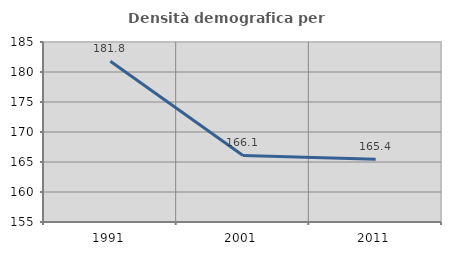
| Category | Densità demografica |
|---|---|
| 1991.0 | 181.788 |
| 2001.0 | 166.086 |
| 2011.0 | 165.443 |